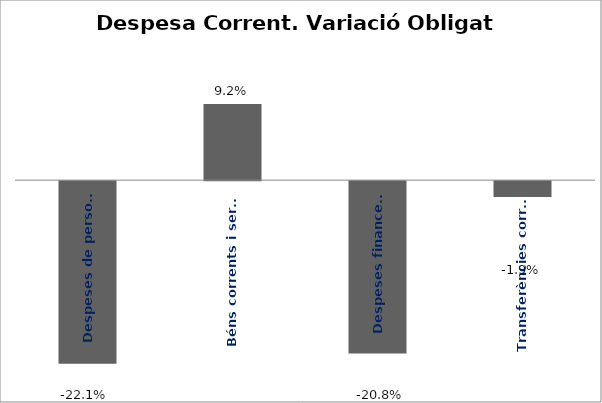
| Category | Series 0 |
|---|---|
| Despeses de personal | -0.221 |
| Béns corrents i serveis | 0.092 |
| Despeses financeres | -0.208 |
| Transferències corrents | -0.019 |